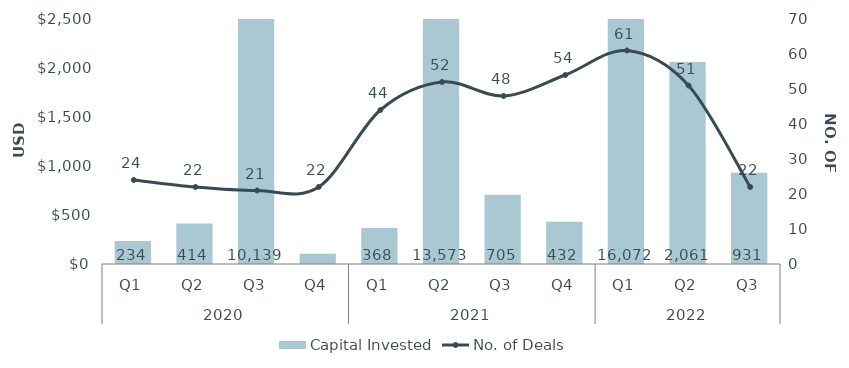
| Category | Capital Invested |
|---|---|
| 0 | 233.725 |
| 1 | 414.336 |
| 2 | 10138.85 |
| 3 | 103.983 |
| 4 | 368.119 |
| 5 | 13572.596 |
| 6 | 705.441 |
| 7 | 431.519 |
| 8 | 16072.262 |
| 9 | 2061.05 |
| 10 | 930.6 |